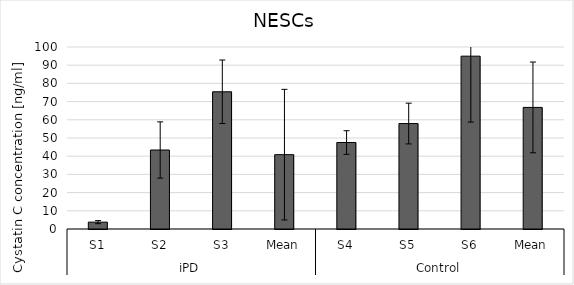
| Category | Series 0 |
|---|---|
| 0 | 3.771 |
| 1 | 43.406 |
| 2 | 75.389 |
| 3 | 40.855 |
| 4 | 47.518 |
| 5 | 57.938 |
| 6 | 94.962 |
| 7 | 66.806 |